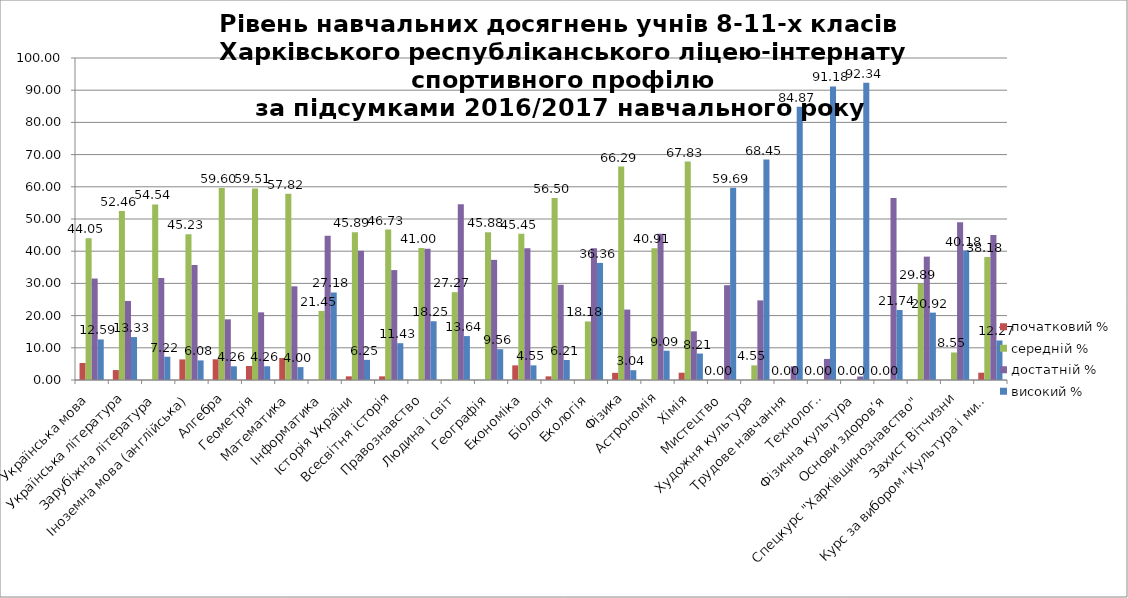
| Category | початковий % | середній % | достатній % | високий % |
|---|---|---|---|---|
| Українська мова | 5.273 | 44.051 | 31.511 | 12.594 |
| Українська література | 3.087 | 52.457 | 24.552 | 13.333 |
| Зарубіжна література | 0 | 54.54 | 31.67 | 7.22 |
| Іноземна мова (англійська) | 6.398 | 45.229 | 35.719 | 6.083 |
| Алгебра | 6.431 | 59.601 | 18.841 | 4.257 |
| Геометрія | 4.348 | 59.511 | 21.014 | 4.257 |
| Математика | 6.818 | 57.818 | 29.091 | 4 |
| Інформатика | 0 | 21.445 | 44.806 | 27.178 |
| Історія України | 1.136 | 45.885 | 40.154 | 6.254 |
| Всесвітня історія | 1.136 | 46.725 | 34.135 | 11.432 |
| Правознавство | 0 | 41 | 40.75 | 18.25 |
| Людина і світ | 0 | 27.273 | 54.545 | 13.636 |
| Географія | 0 | 45.882 | 37.312 | 9.56 |
| Економіка | 4.545 | 45.455 | 40.909 | 4.545 |
| Біологія | 1.136 | 56.498 | 29.583 | 6.212 |
| Екологія | 0 | 18.182 | 40.909 | 36.364 |
| Фізика | 2.223 | 66.289 | 21.875 | 3.042 |
| Астрономія | 0 | 40.909 | 45.455 | 9.091 |
| Хімія | 2.273 | 67.831 | 15.113 | 8.212 |
| Мистецтво | 0 | 0 | 29.438 | 59.692 |
| Художня культура | 0 | 4.545 | 24.727 | 68.455 |
| Трудове навчання | 0 | 0 | 4.257 | 84.873 |
| Технології | 0 | 0 | 6.545 | 91.182 |
| Фізична культура | 0 | 0 | 1.087 | 92.342 |
| Основи здоров’я | 0 | 0 | 56.522 | 21.739 |
| Спецкурс "Харківщинознавство" | 0 | 29.891 | 38.315 | 20.924 |
| Захист Вітчизни | 0 | 8.545 | 49 | 40.182 |
| Курс за вибором "Культура і мистецтво  Великої Британії" | 2.273 | 38.182 | 45 | 12.273 |